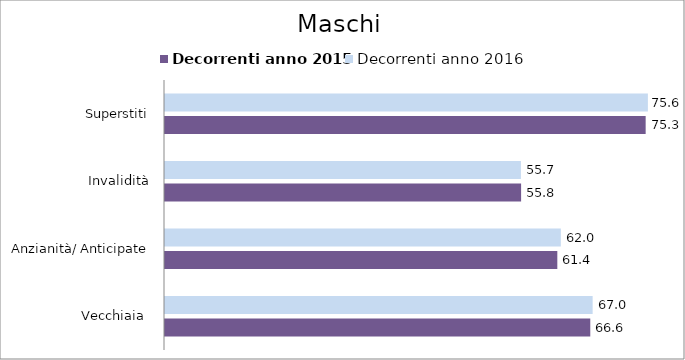
| Category | Decorrenti anno 2015 | Decorrenti anno 2016 |
|---|---|---|
| Vecchiaia  | 66.58 | 66.95 |
| Anzianità/ Anticipate | 61.42 | 61.97 |
| Invalidità | 55.75 | 55.72 |
| Superstiti | 75.25 | 75.6 |